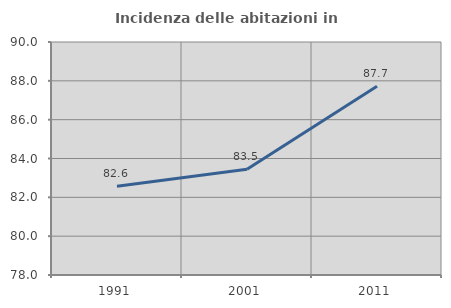
| Category | Incidenza delle abitazioni in proprietà  |
|---|---|
| 1991.0 | 82.57 |
| 2001.0 | 83.452 |
| 2011.0 | 87.723 |